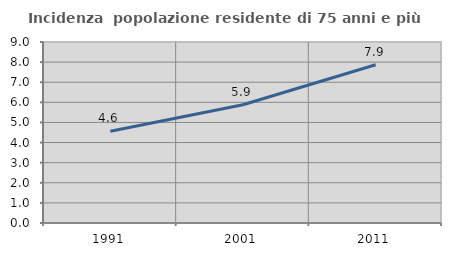
| Category | Incidenza  popolazione residente di 75 anni e più |
|---|---|
| 1991.0 | 4.559 |
| 2001.0 | 5.877 |
| 2011.0 | 7.866 |